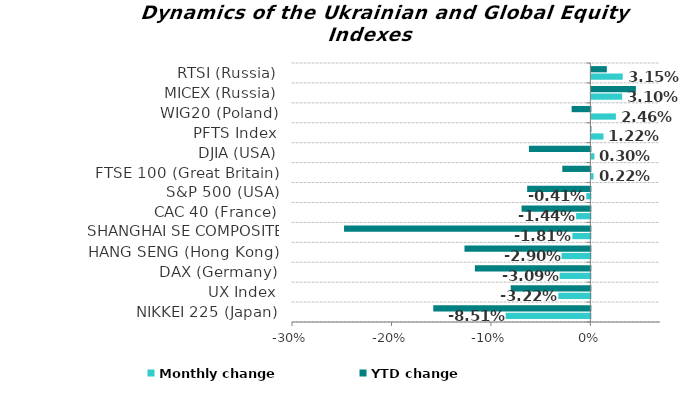
| Category | Monthly change | YTD change |
|---|---|---|
| NIKKEI 225 (Japan) | -0.085 | -0.158 |
| UX Index | -0.032 | -0.08 |
| DAX (Germany) | -0.031 | -0.116 |
| HANG SENG (Hong Kong) | -0.029 | -0.127 |
| SHANGHAI SE COMPOSITE (China) | -0.018 | -0.248 |
| CAC 40 (France) | -0.014 | -0.069 |
| S&P 500 (USA) | -0.004 | -0.064 |
| FTSE 100 (Great Britain) | 0.002 | -0.028 |
| DJIA (USA) | 0.003 | -0.062 |
| PFTS Index | 0.012 | 0 |
| WIG20 (Poland) | 0.025 | -0.019 |
| MICEX (Russia) | 0.031 | 0.045 |
| RTSI (Russia) | 0.032 | 0.016 |